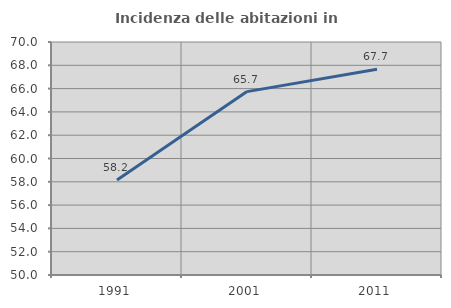
| Category | Incidenza delle abitazioni in proprietà  |
|---|---|
| 1991.0 | 58.159 |
| 2001.0 | 65.742 |
| 2011.0 | 67.657 |